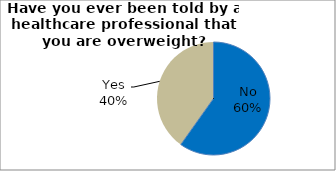
| Category | Series 0 |
|---|---|
| No | 59.828 |
| Yes | 40.172 |